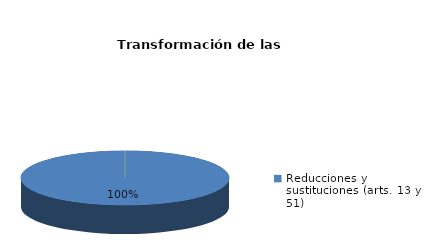
| Category | Series 0 |
|---|---|
| Reducciones y sustituciones (arts. 13 y 51) | 1 |
| Por quebrantamiento (art. 50.2) | 0 |
| Cancelaciones anticipadas | 0 |
| Traslado a Centros Penitenciarios | 0 |
| Conversión internamientos en cerrados (art. 51.2) | 0 |